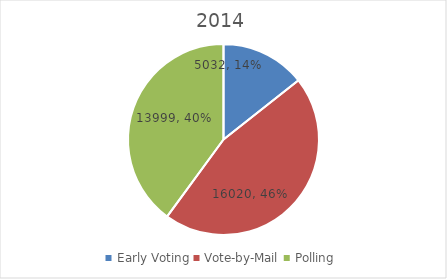
| Category | Series 0 |
|---|---|
| Early Voting | 5032 |
| Vote-by-Mail | 16020 |
| Polling | 13999 |